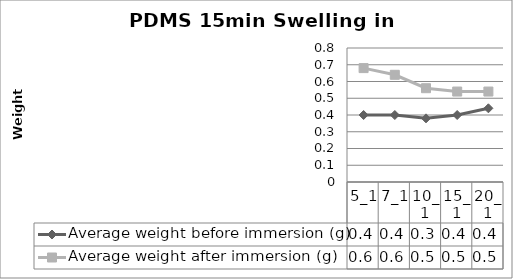
| Category | Average weight before immersion (g) | Average weight after immersion (g) |
|---|---|---|
| 5_1 | 0.4 | 0.68 |
| 7_1 | 0.4 | 0.64 |
| 10_1 | 0.38 | 0.56 |
| 15_1 | 0.4 | 0.54 |
| 20_1 | 0.44 | 0.54 |